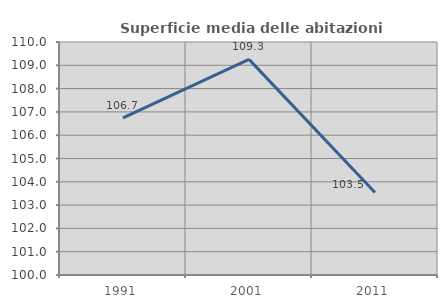
| Category | Superficie media delle abitazioni occupate |
|---|---|
| 1991.0 | 106.748 |
| 2001.0 | 109.254 |
| 2011.0 | 103.544 |